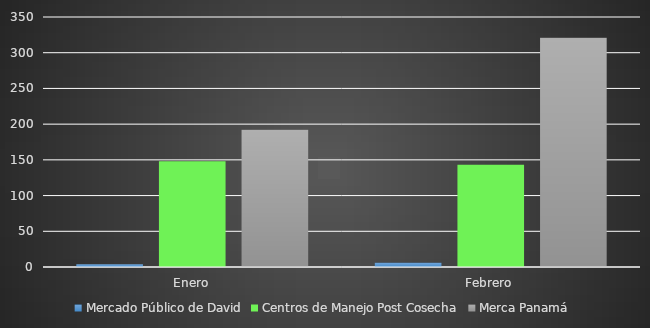
| Category | Mercado Público de David | Centros de Manejo Post Cosecha | Merca Panamá |
|---|---|---|---|
| Enero | 4 | 148 | 192 |
| Febrero | 6 | 143 | 321 |